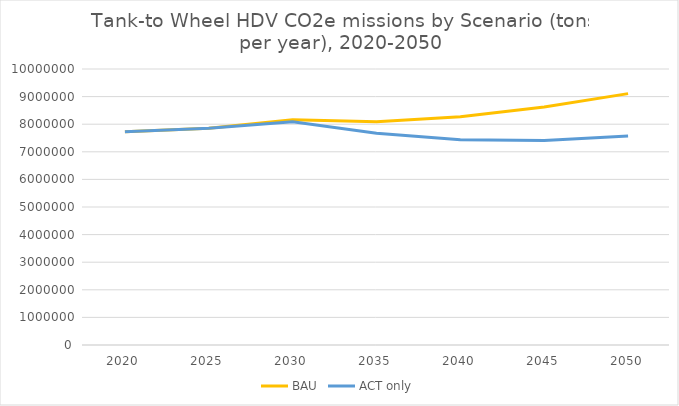
| Category | BAU | ACT only |
|---|---|---|
| 2020.0 | 7724396.632 | 7724396.632 |
| 2025.0 | 7851365.932 | 7851365.932 |
| 2030.0 | 8162153.781 | 8085337.816 |
| 2035.0 | 8092589.68 | 7672494.488 |
| 2040.0 | 8272301.545 | 7438376.944 |
| 2045.0 | 8620705.602 | 7408748.428 |
| 2050.0 | 9108392.404 | 7573907.162 |